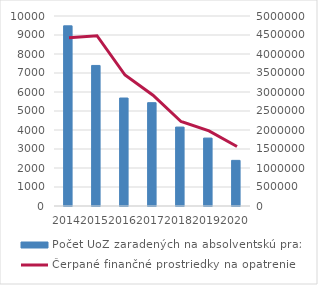
| Category | Počet UoZ zaradených na absolventskú prax |
|---|---|
| 2014.0 | 9482 |
| 2015.0 | 7398 |
| 2016.0 | 5683 |
| 2017.0 | 5439 |
| 2018.0 | 4154 |
| 2019.0 | 3575 |
| 2020.0 | 2402 |